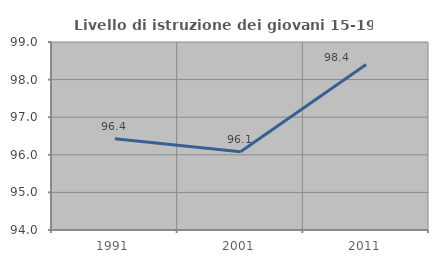
| Category | Livello di istruzione dei giovani 15-19 anni |
|---|---|
| 1991.0 | 96.429 |
| 2001.0 | 96.078 |
| 2011.0 | 98.4 |